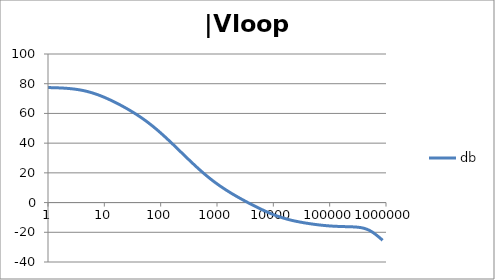
| Category | db |
|---|---|
| 1.0 | 77.407 |
| 1.0715193052376064 | 77.385 |
| 1.1481536214968828 | 77.359 |
| 1.2302687708123814 | 77.33 |
| 1.318256738556407 | 77.296 |
| 1.4125375446227544 | 77.258 |
| 1.513561248436208 | 77.215 |
| 1.6218100973589298 | 77.166 |
| 1.7378008287493754 | 77.11 |
| 1.8620871366628673 | 77.047 |
| 1.9952623149688797 | 76.976 |
| 2.1379620895022318 | 76.895 |
| 2.2908676527677727 | 76.805 |
| 2.45470891568503 | 76.703 |
| 2.6302679918953817 | 76.589 |
| 2.8183829312644537 | 76.461 |
| 3.0199517204020156 | 76.319 |
| 3.235936569296282 | 76.162 |
| 3.467368504525316 | 75.988 |
| 3.7153522909717256 | 75.796 |
| 3.9810717055349727 | 75.585 |
| 4.265795188015926 | 75.355 |
| 4.570881896148749 | 75.105 |
| 4.897788193684462 | 74.834 |
| 5.2480746024977245 | 74.542 |
| 5.62341325190349 | 74.229 |
| 6.025595860743575 | 73.895 |
| 6.456542290346554 | 73.539 |
| 6.918309709189363 | 73.163 |
| 7.4131024130091765 | 72.767 |
| 7.943282347242814 | 72.351 |
| 8.511380382023765 | 71.917 |
| 9.120108393559095 | 71.465 |
| 9.772372209558105 | 70.995 |
| 10.47128548050899 | 70.51 |
| 11.22018454301963 | 70.009 |
| 12.022644346174127 | 69.493 |
| 12.88249551693134 | 68.964 |
| 13.803842646028851 | 68.421 |
| 14.791083881682074 | 67.867 |
| 15.848931924611136 | 67.3 |
| 16.98243652461744 | 66.721 |
| 18.197008586099834 | 66.131 |
| 19.498445997580447 | 65.529 |
| 20.892961308540382 | 64.917 |
| 22.387211385683386 | 64.292 |
| 23.988329190194897 | 63.656 |
| 25.703957827688622 | 63.008 |
| 27.54228703338165 | 62.347 |
| 29.51209226666385 | 61.673 |
| 31.62277660168379 | 60.985 |
| 33.884415613920254 | 60.283 |
| 36.307805477010106 | 59.565 |
| 38.90451449942804 | 58.83 |
| 41.686938347033525 | 58.079 |
| 44.6683592150963 | 57.309 |
| 47.86300923226381 | 56.521 |
| 51.28613839913647 | 55.713 |
| 54.95408738576247 | 54.886 |
| 58.88436553555889 | 54.038 |
| 63.09573444801931 | 53.169 |
| 67.60829753919813 | 52.28 |
| 72.44359600749901 | 51.37 |
| 77.62471166286915 | 50.44 |
| 83.17637711026705 | 49.49 |
| 89.12509381337456 | 48.521 |
| 95.49925860214357 | 47.534 |
| 102.32929922807544 | 46.53 |
| 109.64781961431841 | 45.51 |
| 117.48975549395293 | 44.475 |
| 125.89254117941665 | 43.426 |
| 134.89628825916537 | 42.366 |
| 144.54397707459273 | 41.295 |
| 154.88166189124806 | 40.215 |
| 165.95869074375608 | 39.127 |
| 177.82794100389225 | 38.032 |
| 190.5460717963248 | 36.933 |
| 204.17379446695278 | 35.83 |
| 218.77616239495524 | 34.725 |
| 234.42288153199212 | 33.619 |
| 251.18864315095806 | 32.515 |
| 269.15348039269156 | 31.412 |
| 288.4031503126605 | 30.312 |
| 309.0295432513591 | 29.218 |
| 331.1311214825911 | 28.13 |
| 354.81338923357566 | 27.049 |
| 380.18939632056095 | 25.978 |
| 407.3802778041123 | 24.918 |
| 436.5158322401654 | 23.869 |
| 467.7351412871979 | 22.834 |
| 501.18723362727184 | 21.813 |
| 537.0317963702526 | 20.809 |
| 575.4399373371566 | 19.821 |
| 616.5950018614822 | 18.851 |
| 660.6934480075952 | 17.901 |
| 707.9457843841375 | 16.969 |
| 758.5775750291831 | 16.058 |
| 812.8305161640983 | 15.167 |
| 870.9635899560801 | 14.296 |
| 933.2543007969903 | 13.445 |
| 999.9999999999998 | 12.615 |
| 1071.5193052376057 | 11.803 |
| 1148.1536214968828 | 11.011 |
| 1230.2687708123801 | 10.236 |
| 1318.2567385564053 | 9.479 |
| 1412.537544622753 | 8.737 |
| 1513.5612484362066 | 8.011 |
| 1621.8100973589292 | 7.299 |
| 1737.8008287493742 | 6.601 |
| 1862.0871366628671 | 5.914 |
| 1995.2623149688786 | 5.239 |
| 2137.9620895022326 | 4.575 |
| 2290.867652767771 | 3.92 |
| 2454.708915685027 | 3.275 |
| 2630.26799189538 | 2.638 |
| 2818.382931264451 | 2.009 |
| 3019.9517204020176 | 1.387 |
| 3235.9365692962774 | 0.774 |
| 3467.368504525316 | 0.167 |
| 3715.352290971724 | -0.433 |
| 3981.07170553497 | -1.025 |
| 4265.795188015923 | -1.61 |
| 4570.881896148745 | -2.188 |
| 4897.788193684463 | -2.759 |
| 5248.074602497726 | -3.321 |
| 5623.413251903489 | -3.875 |
| 6025.595860743574 | -4.419 |
| 6456.54229034655 | -4.954 |
| 6918.309709189357 | -5.479 |
| 7413.102413009165 | -5.992 |
| 7943.282347242815 | -6.494 |
| 8511.380382023763 | -6.983 |
| 9120.108393559092 | -7.458 |
| 9772.3722095581 | -7.918 |
| 10471.285480509003 | -8.364 |
| 11220.184543019639 | -8.793 |
| 12022.64434617411 | -9.206 |
| 12882.495516931338 | -9.602 |
| 13803.842646028841 | -9.981 |
| 14791.083881682063 | -10.342 |
| 15848.931924611119 | -10.686 |
| 16982.436524617453 | -11.012 |
| 18197.008586099837 | -11.322 |
| 19498.445997580417 | -11.615 |
| 20892.961308540387 | -11.894 |
| 22387.211385683382 | -12.157 |
| 23988.32919019488 | -12.408 |
| 25703.957827688606 | -12.646 |
| 27542.28703338167 | -12.873 |
| 29512.092266663854 | -13.089 |
| 31622.77660168378 | -13.297 |
| 33884.41561392023 | -13.497 |
| 36307.805477010166 | -13.689 |
| 38904.514499428085 | -13.874 |
| 41686.93834703348 | -14.052 |
| 44668.35921509631 | -14.225 |
| 47863.00923226382 | -14.391 |
| 51286.13839913646 | -14.551 |
| 54954.08738576241 | -14.705 |
| 58884.365535558936 | -14.852 |
| 63095.73444801934 | -14.992 |
| 67608.29753919817 | -15.125 |
| 72443.59600749899 | -15.25 |
| 77624.71166286913 | -15.367 |
| 83176.37711026703 | -15.476 |
| 89125.09381337445 | -15.577 |
| 95499.25860214363 | -15.669 |
| 102329.29922807543 | -15.753 |
| 109647.81961431848 | -15.828 |
| 117489.75549395289 | -15.896 |
| 125892.54117941685 | -15.957 |
| 134896.28825916522 | -16.011 |
| 144543.97707459255 | -16.058 |
| 154881.66189124787 | -16.099 |
| 165958.69074375575 | -16.136 |
| 177827.9410038922 | -16.169 |
| 190546.07179632425 | -16.199 |
| 204173.79446695274 | -16.229 |
| 218776.16239495497 | -16.259 |
| 234422.88153199226 | -16.293 |
| 251188.64315095753 | -16.335 |
| 269153.480392691 | -16.388 |
| 288403.15031266044 | -16.457 |
| 309029.5432513582 | -16.55 |
| 331131.1214825907 | -16.675 |
| 354813.3892335749 | -16.84 |
| 380189.3963205612 | -17.057 |
| 407380.2778041119 | -17.337 |
| 436515.8322401649 | -17.69 |
| 467735.14128719777 | -18.124 |
| 501187.2336272717 | -18.645 |
| 537031.7963702519 | -19.255 |
| 575439.9373371559 | -19.951 |
| 616595.001861482 | -20.725 |
| 660693.4480075944 | -21.569 |
| 707945.7843841374 | -22.469 |
| 758577.575029183 | -23.415 |
| 812830.5161640996 | -24.395 |
| 870963.5899560791 | -25.398 |